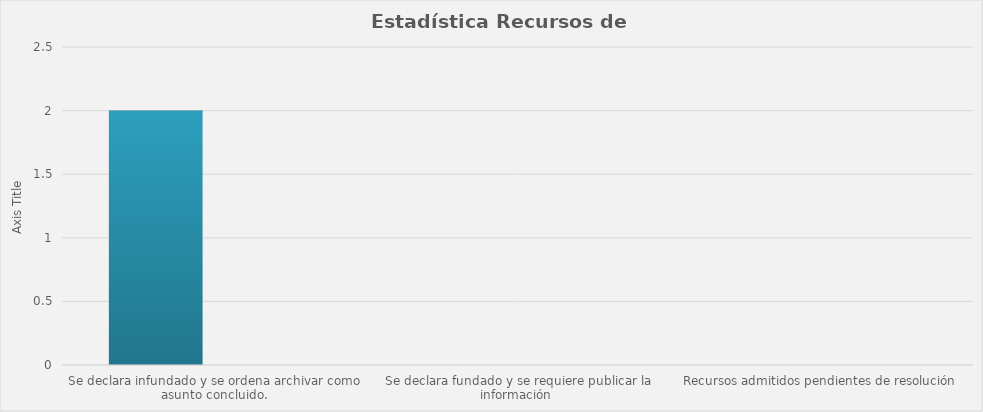
| Category | Series 0 | Series 1 |
|---|---|---|
| Se declara infundado y se ordena archivar como asunto concluido. | 2 |  |
| Se declara fundado y se requiere publicar la información  | 0 |  |
| Recursos admitidos pendientes de resolución | 0 |  |